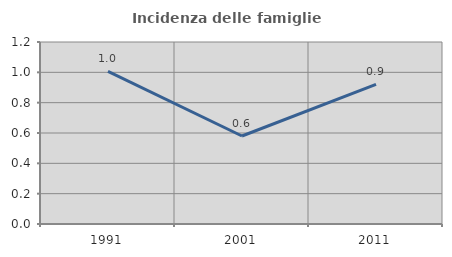
| Category | Incidenza delle famiglie numerose |
|---|---|
| 1991.0 | 1.006 |
| 2001.0 | 0.58 |
| 2011.0 | 0.921 |